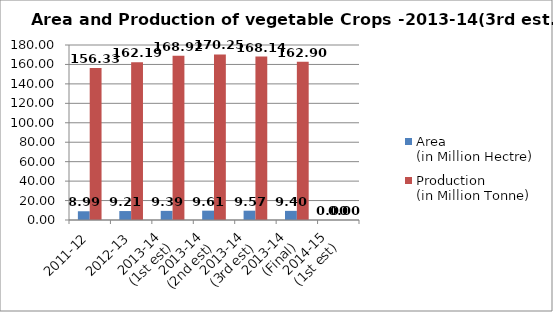
| Category | Area
(in Million Hectre) | Production
(in Million Tonne) |
|---|---|---|
| 2011-12 | 8.989 | 156.325 |
| 2012-13 | 9.205 | 162.187 |
| 2013-14
(1st est) | 9.39 | 168.919 |
| 2013-14
(2nd est) | 9.609 | 170.248 |
| 2013-14
(3rd est) | 9.567 | 168.142 |
| 2013-14
(Final) | 9.396 | 162.897 |
| 2014-15
(1st est) | 0 | 0 |